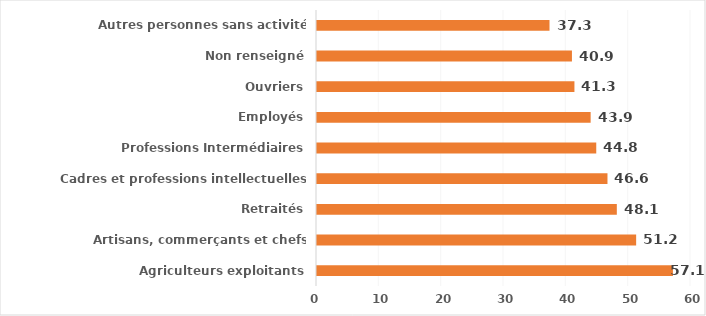
| Category | Series 0 |
|---|---|
| Agriculteurs exploitants | 57.1 |
| Artisans, commerçants et chefs d'entreprise | 51.2 |
| Retraités | 48.1 |
| Cadres et professions intellectuelles supérieures | 46.6 |
| Professions Intermédiaires | 44.8 |
| Employés | 43.9 |
| Ouvriers | 41.3 |
| Non renseigné | 40.9 |
| Autres personnes sans activité professionnelle | 37.3 |